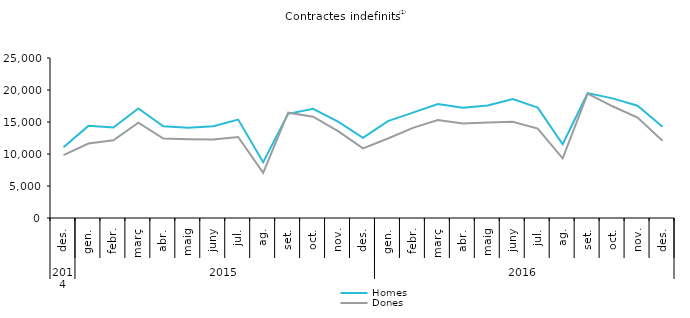
| Category | Homes | Dones |
|---|---|---|
| 0 | 11063 | 9835 |
| 1 | 14395 | 11628 |
| 2 | 14128 | 12146 |
| 3 | 17113 | 14907 |
| 4 | 14317 | 12405 |
| 5 | 14116 | 12312 |
| 6 | 14345 | 12248 |
| 7 | 15381 | 12651 |
| 8 | 8709 | 7060 |
| 9 | 16267 | 16458 |
| 10 | 17057 | 15825 |
| 11 | 15060 | 13584 |
| 12 | 12544 | 10877 |
| 13 | 15139 | 12421 |
| 14 | 16470 | 14080 |
| 15 | 17798 | 15312 |
| 16 | 17236 | 14774 |
| 17 | 17579 | 14912 |
| 18 | 18578 | 15022 |
| 19 | 17244 | 13970 |
| 20 | 11521 | 9309 |
| 21 | 19525 | 19446 |
| 22 | 18694 | 17458 |
| 23 | 17541 | 15692 |
| 24 | 14259 | 12054 |